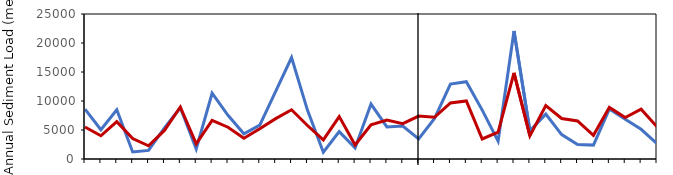
| Category | Observed (metric tons/year) | Baseline calibrated (metric tons/year) |
|---|---|---|
| 0 | 8587.151 | 5522 |
| 1 | 5042.122 | 4003 |
| 2 | 8496.605 | 6432 |
| 3 | 1207.753 | 3534 |
| 4 | 1485.516 | 2285 |
| 5 | 5374.004 | 4927 |
| 6 | 8832.062 | 8967 |
| 7 | 1728.951 | 2620 |
| 8 | 11337.403 | 6653 |
| 9 | 7534.808 | 5482 |
| 10 | 4338.37 | 3592 |
| 11 | 5844.211 | 5212 |
| 12 | 11644.666 | 6957 |
| 13 | 17495.489 | 8483 |
| 14 | 8424.631 | 5772 |
| 15 | 1166.16 | 3288 |
| 16 | 4716.793 | 7317 |
| 17 | 1879.708 | 2413 |
| 18 | 9463.908 | 5876 |
| 19 | 5533.008 | 6705 |
| 20 | 5690.864 | 6105 |
| 21 | 3472.5 | 7403 |
| 22 | 7003.975 | 7200 |
| 23 | 12915.477 | 9666 |
| 24 | 13336.885 | 10010 |
| 25 | 8430.574 | 3451 |
| 26 | 3090.113 | 4614 |
| 27 | 22081.273 | 14850 |
| 28 | 4852.762 | 3990 |
| 29 | 7737.409 | 9207 |
| 30 | 4204.82 | 6987 |
| 31 | 2509.158 | 6554 |
| 32 | 2394.858 | 4081 |
| 33 | 8604.672 | 8902 |
| 34 | 6849.913 | 7135 |
| 35 | 5124.803 | 8598 |
| 36 | 2657.45 | 5559 |